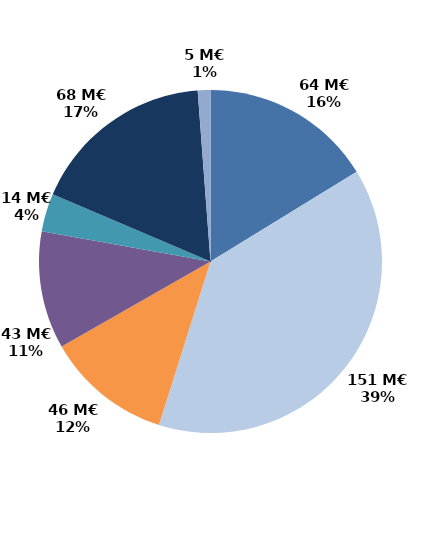
| Category | Series 0 |
|---|---|
| Accueil et information (CEP 1) | 63.607 |
| Accompagnement renforcé (CEP 2 et 3) | 151.203 |
| Suivi | 46.492 |
| Missions locales | 43.411 |
| CSP | 14.054 |
| Aide à la création d'entreprise | 68.116 |
| Aide à l'insertion | 4.676 |